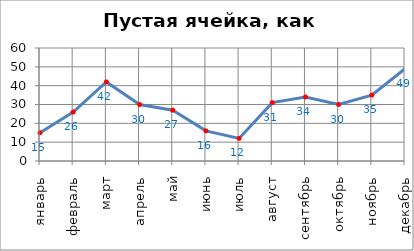
| Category | Филиал1 |
|---|---|
| январь | 15 |
| февраль | 26 |
| март | 42 |
| апрель | 30 |
| май | 27 |
| июнь | 16 |
| июль | 12 |
| август | 31 |
| сентябрь | 34 |
| октябрь | 30 |
| ноябрь | 35 |
| декабрь | 49 |